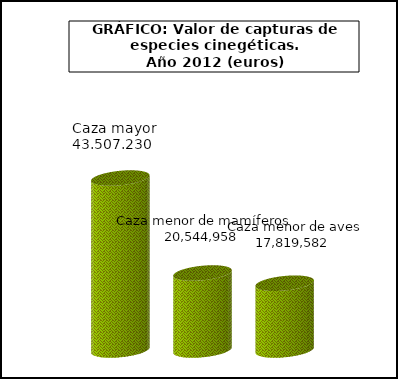
| Category | Cazar |
|---|---|
| Caza mayor | 45886181 |
| Caza menor de mamíferos | 20544957.5 |
| Caza menor de aves | 17819581.75 |